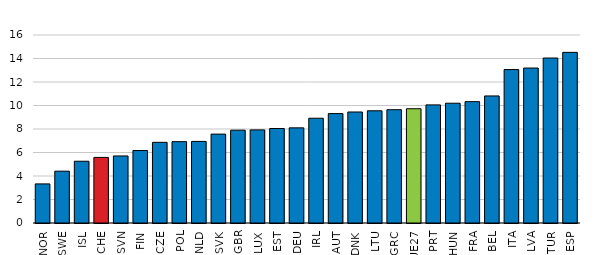
| Category | Series 0 |
|---|---|
| NOR | 3.327 |
| SWE | 4.41 |
| ISL | 5.257 |
| CHE | 5.581 |
| SVN | 5.707 |
| FIN | 6.168 |
| CZE | 6.865 |
| POL | 6.923 |
| NLD | 6.943 |
| SVK | 7.565 |
| GBR | 7.899 |
| LUX | 7.923 |
| EST | 8.042 |
| DEU | 8.096 |
| IRL | 8.918 |
| AUT | 9.311 |
| DNK | 9.447 |
| LTU | 9.549 |
| GRC | 9.643 |
| UE27 | 9.724 |
| PRT | 10.052 |
| HUN | 10.194 |
| FRA | 10.328 |
| BEL | 10.813 |
| ITA | 13.058 |
| LVA | 13.188 |
| TUR | 14.041 |
| ESP | 14.521 |